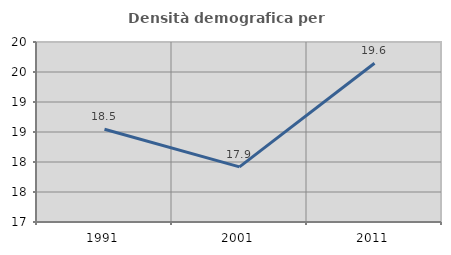
| Category | Densità demografica |
|---|---|
| 1991.0 | 18.545 |
| 2001.0 | 17.919 |
| 2011.0 | 19.646 |